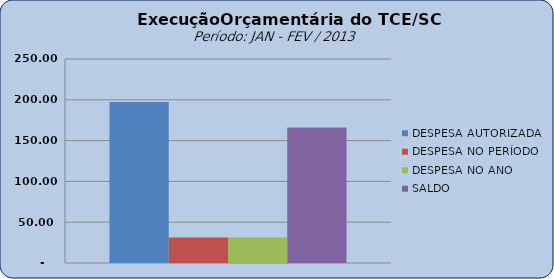
| Category | DESPESA AUTORIZADA | DESPESA NO PERÍODO | DESPESA NO ANO | SALDO |
|---|---|---|---|---|
| 0 | 197209377.59 | 31155862.21 | 31155862.21 | 166053515.38 |